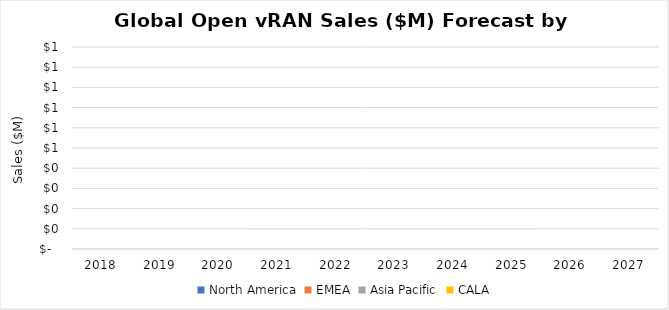
| Category | North America | EMEA | Asia Pacific | CALA |
|---|---|---|---|---|
| 2018.0 | 0 | 0 | 0 | 0 |
| 2019.0 | 0 | 0 | 0 | 0 |
| 2020.0 | 0 | 0 | 0 | 0 |
| 2021.0 | 0 | 0 | 0 | 0 |
| 2022.0 | 0 | 0 | 0 | 0 |
| 2023.0 | 0 | 0 | 0 | 0 |
| 2024.0 | 0 | 0 | 0 | 0 |
| 2025.0 | 0 | 0 | 0 | 0 |
| 2026.0 | 0 | 0 | 0 | 0 |
| 2027.0 | 0 | 0 | 0 | 0 |